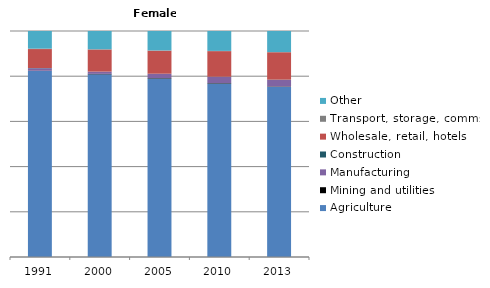
| Category | Agriculture | Mining and utilities | Manufacturing | Construction | Wholesale, retail, hotels | Transport, storage, comms | Other |
|---|---|---|---|---|---|---|---|
| 1991.0 | 82.4 | 0.1 | 1.1 | 0.1 | 8.4 | 0.2 | 7.8 |
| 2000.0 | 81 | 0.2 | 1 | 0 | 9.8 | 0.1 | 8.1 |
| 2005.0 | 79 | 0.2 | 1.9 | 0 | 10.2 | 0.1 | 8.6 |
| 2010.0 | 76.7 | 0.2 | 2.7 | 0.1 | 11.3 | 0.1 | 8.8 |
| 2013.0 | 75.2 | 0.2 | 2.9 | 0.1 | 12.1 | 0.1 | 9.3 |